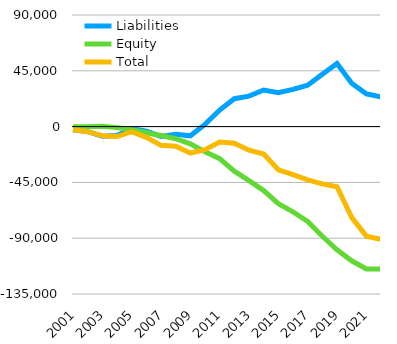
| Category | Liabilities  | Equity  | Total |
|---|---|---|---|
| 2001 | -2578 | -42 | -2620 |
| 2002 | -4059.9 | -35 | -4094.9 |
| 2003 | -7679.9 | 329 | -7350.9 |
| 2004 | -7215.9 | -821 | -8036.9 |
| 2005 | -1540.6 | -2549 | -4089.6 |
| 2006 | -3716.6 | -4971 | -8687.6 |
| 2007 | -7887.6 | -7237 | -15124.6 |
| 2008 | -6088.6 | -9748 | -15836.6 |
| 2009 | -7404.6 | -13929 | -21333.6 |
| 2010 | 1767.4 | -20323 | -18555.6 |
| 2011 | 13348.4 | -25860 | -12511.6 |
| 2012 | 22512.4 | -35961 | -13448.6 |
| 2013 | 24592.4 | -43601 | -19008.6 |
| 2014 | 29466.4 | -51608 | -22141.6 |
| 2015 | 27346.4 | -62177 | -34830.6 |
| 2016 | 30031.4 | -68708 | -38676.6 |
| 2017 | 33403.4 | -76435 | -43031.6 |
| 2018 | 42303.4 | -88485 | -46181.6 |
| 2019 | 50900.4 | -99356 | -48455.6 |
| 2020 | 35008.4 | -108204 | -73195.6 |
| 2021 | 26448.4 | -114799 | -88350.6 |
| 2021 | 23939.4 | -114866 | -90926.6 |